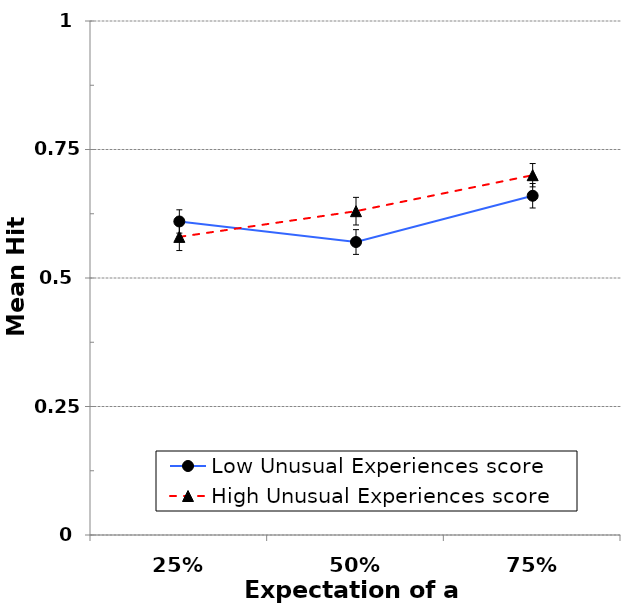
| Category | Low Unusual Experiences score | High Unusual Experiences score |
|---|---|---|
| 25% | 0.61 | 0.58 |
| 50% | 0.57 | 0.63 |
| 75% | 0.66 | 0.7 |